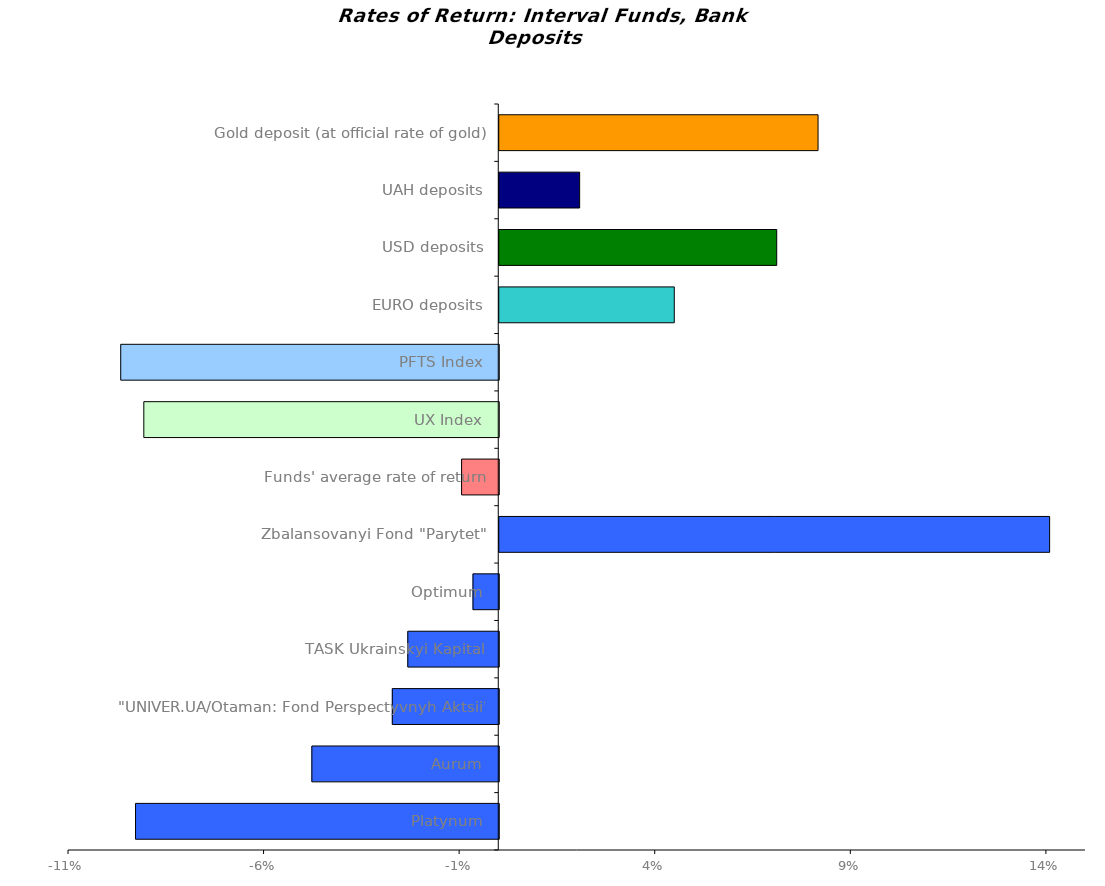
| Category | Series 0 |
|---|---|
| Platynum | -0.093 |
| Aurum | -0.048 |
| "UNIVER.UA/Otaman: Fond Perspectyvnyh Aktsii" | -0.027 |
| TASK Ukrainskyi Kapital | -0.023 |
| Optimum | -0.007 |
| Zbalansovanyi Fond "Parytet" | 0.141 |
| Funds' average rate of return | -0.01 |
| UX Index | -0.091 |
| PFTS Index | -0.097 |
| EURO deposits | 0.045 |
| USD deposits | 0.071 |
| UAH deposits | 0.021 |
| Gold deposit (at official rate of gold) | 0.081 |